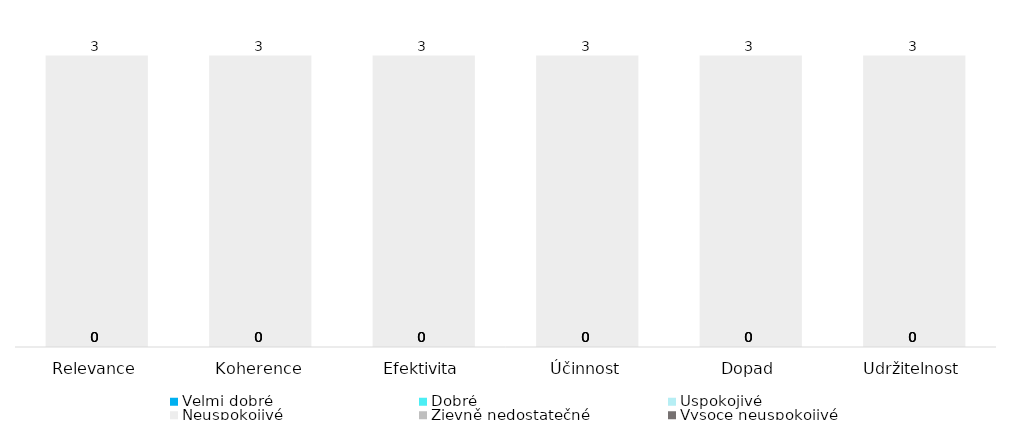
| Category | Velmi dobré | Dobré | Uspokojivé | Neuspokojivé | Zjevně nedostatečné | Vysoce neuspokojivé |
|---|---|---|---|---|---|---|
| Relevance | 0 | 0 | 0 | 3 | 0 | 0 |
| Koherence | 0 | 0 | 0 | 3 | 0 | 0 |
| Efektivita | 0 | 0 | 0 | 3 | 0 | 0 |
| Účinnost | 0 | 0 | 0 | 3 | 0 | 0 |
| Dopad | 0 | 0 | 0 | 3 | 0 | 0 |
| Udržitelnost | 0 | 0 | 0 | 3 | 0 | 0 |